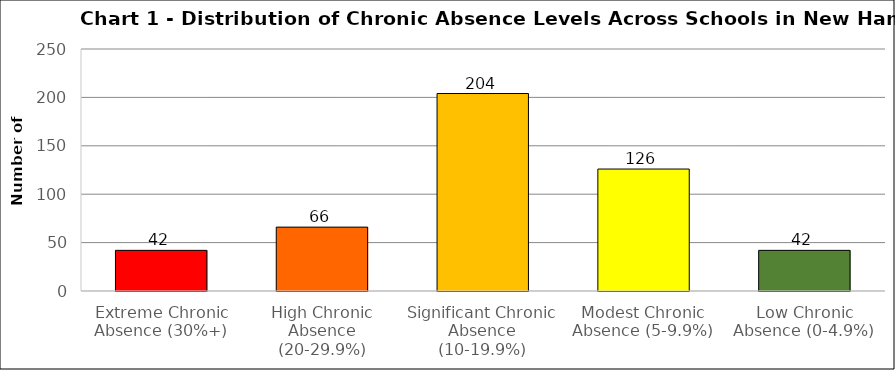
| Category | Series 0 |
|---|---|
| Extreme Chronic Absence (30%+) | 42 |
| High Chronic Absence (20-29.9%) | 66 |
| Significant Chronic Absence (10-19.9%) | 204 |
| Modest Chronic Absence (5-9.9%) | 126 |
| Low Chronic Absence (0-4.9%) | 42 |